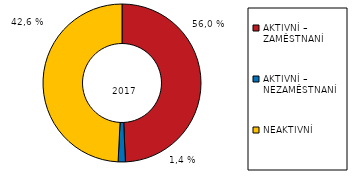
| Category | Series 0 |
|---|---|
| AKTIVNÍ – ZAMĚSTNANÍ | 5221604.795 |
| AKTIVNÍ – NEZAMĚSTNANÍ | 155535.278 |
| NEAKTIVNÍ | 5210105.911 |